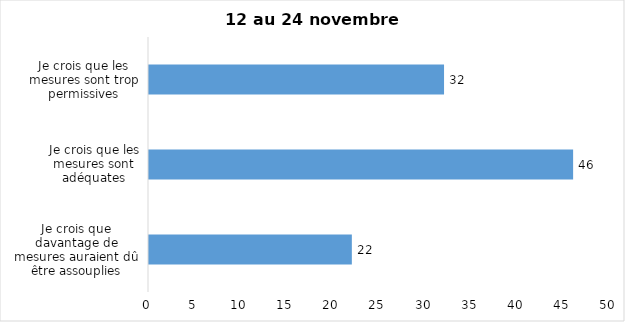
| Category | Series 0 |
|---|---|
| Je crois que davantage de mesures auraient dû être assouplies | 22 |
| Je crois que les mesures sont adéquates | 46 |
| Je crois que les mesures sont trop permissives | 32 |